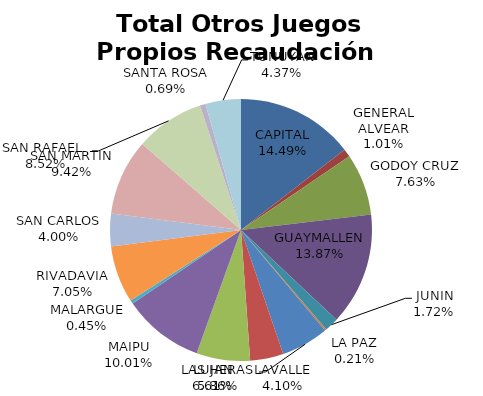
| Category | Total Otros Juegos Propios Recaudación  |
|---|---|
| CAPITAL | 733925 |
| GENERAL ALVEAR | 50900 |
| GODOY CRUZ | 386280 |
| GUAYMALLEN | 702510 |
| JUNIN | 86970 |
| LA PAZ | 10655 |
| LAS HERAS | 296890 |
| LAVALLE | 207745 |
| LUJAN | 334930 |
| MAIPU | 506940 |
| MALARGUE | 22860 |
| RIVADAVIA | 356940 |
| SAN CARLOS | 202320 |
| SAN MARTIN | 476855 |
| SAN RAFAEL  | 431620 |
| SANTA ROSA | 35065 |
| TUNUYAN | 221480 |